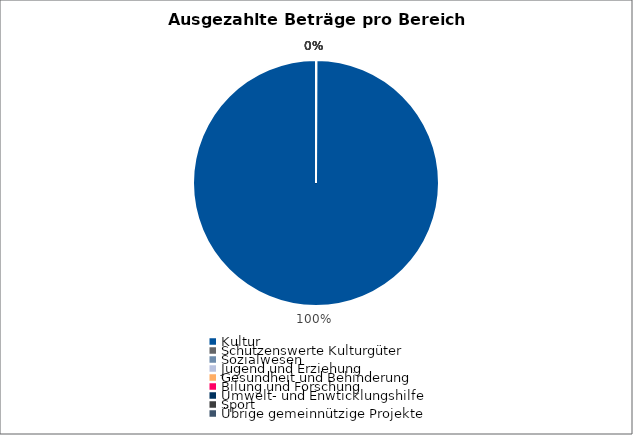
| Category | Series 0 |
|---|---|
| Kultur | 3203950 |
| Schützenswerte Kulturgüter | 0 |
| Sozialwesen | 0 |
| Jugend und Erziehung | 0 |
| Gesundheit und Behinderung | 0 |
| Bilung und Forschung | 0 |
| Umwelt- und Enwticklungshilfe | 0 |
| Sport | 0 |
| Übrige gemeinnützige Projekte | 0 |